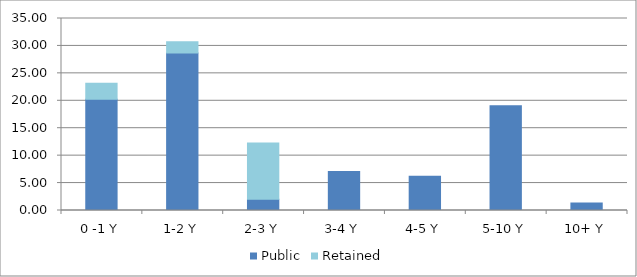
| Category | Public | Retained |
|---|---|---|
| 0 -1 Y | 20.269 | 2.915 |
| 1-2 Y | 28.696 | 2.05 |
| 2-3 Y | 2.05 | 10.248 |
| 3-4 Y | 7.097 | 0 |
| 4-5 Y | 6.224 | 0 |
| 5-10 Y | 19.085 | 0 |
| 10+ Y | 1.366 | 0 |